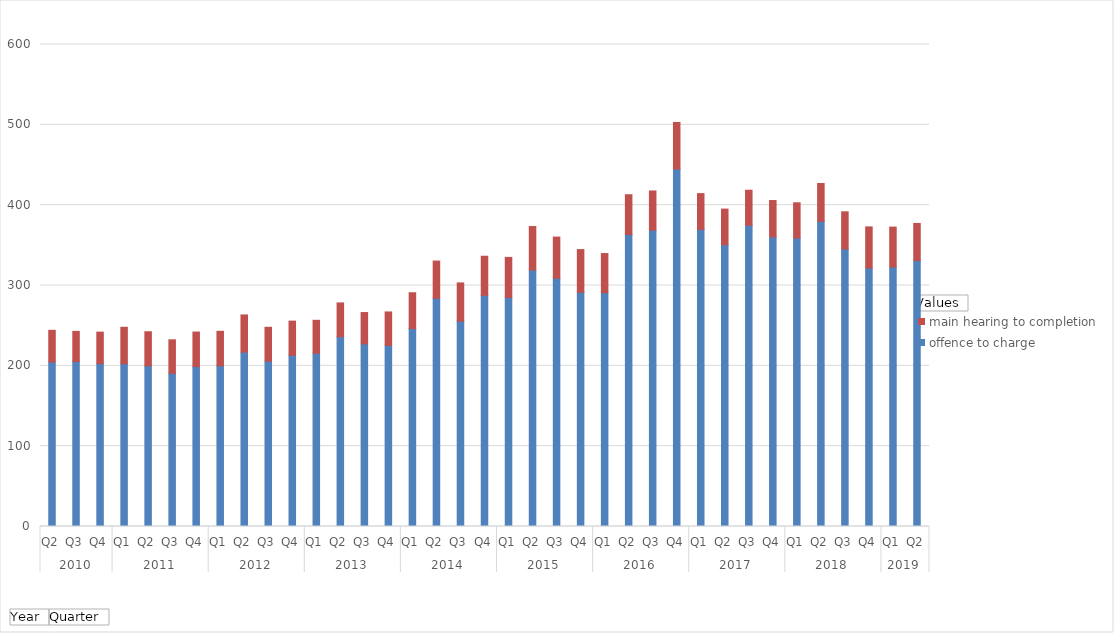
| Category | offence to charge | main hearing to completion |
|---|---|---|
| 0 | 204.83 | 39.378 |
| 1 | 205.397 | 37.531 |
| 2 | 202.764 | 39.207 |
| 3 | 202.604 | 45.393 |
| 4 | 199.99 | 42.425 |
| 5 | 190.652 | 41.746 |
| 6 | 199.044 | 43.036 |
| 7 | 199.992 | 42.993 |
| 8 | 217.038 | 46.31 |
| 9 | 205.803 | 42.192 |
| 10 | 213.089 | 42.578 |
| 11 | 215.585 | 41.095 |
| 12 | 236.218 | 42.099 |
| 13 | 227.297 | 39.032 |
| 14 | 225.414 | 41.682 |
| 15 | 246.322 | 44.683 |
| 16 | 284.117 | 46.303 |
| 17 | 255.664 | 47.545 |
| 18 | 287.7 | 48.726 |
| 19 | 285.137 | 49.856 |
| 20 | 319.218 | 54.187 |
| 21 | 309.058 | 51.212 |
| 22 | 291.464 | 53.246 |
| 23 | 291.013 | 48.759 |
| 24 | 363.532 | 49.478 |
| 25 | 368.902 | 48.787 |
| 26 | 444.982 | 57.964 |
| 27 | 369.865 | 44.488 |
| 28 | 350.684 | 44.423 |
| 29 | 374.95 | 43.634 |
| 30 | 360.425 | 45.346 |
| 31 | 359.041 | 43.895 |
| 32 | 379.854 | 47.122 |
| 33 | 345.436 | 46.285 |
| 34 | 321.753 | 51.215 |
| 35 | 323.004 | 49.707 |
| 36 | 331.063 | 46.204 |